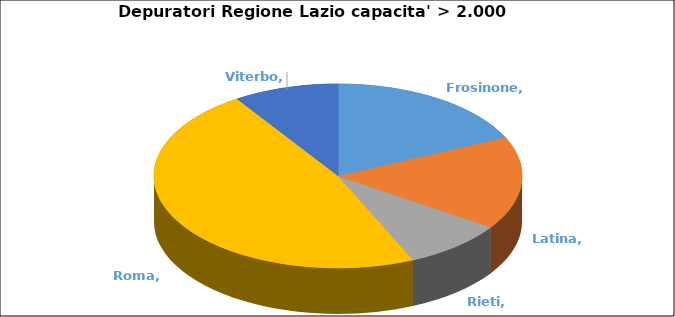
| Category | Series 0 |
|---|---|
| Frosinone | 49 |
| Latina | 44 |
| Rieti | 24 |
| Roma | 128 |
| Viterbo | 25 |